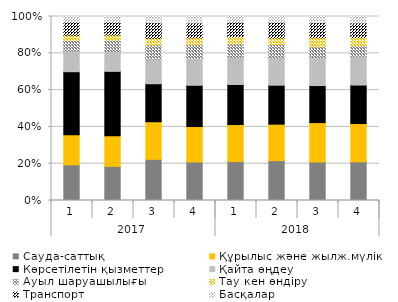
| Category | Сауда-саттық | Құрылыс және жылж.мүлік  | Көрсетілетін қызметтер  | Қайта өңдеу  | Ауыл шаруашылығы  | Тау кен өндіру  | Транспорт | Басқалар |
|---|---|---|---|---|---|---|---|---|
| 0 | 0.194 | 0.164 | 0.342 | 0.112 | 0.057 | 0.029 | 0.072 | 0.03 |
| 1 | 0.185 | 0.167 | 0.35 | 0.109 | 0.06 | 0.029 | 0.07 | 0.03 |
| 2 | 0.224 | 0.204 | 0.206 | 0.135 | 0.076 | 0.037 | 0.084 | 0.034 |
| 3 | 0.209 | 0.193 | 0.224 | 0.147 | 0.074 | 0.037 | 0.08 | 0.035 |
| 4 | 0.211 | 0.201 | 0.218 | 0.149 | 0.072 | 0.038 | 0.08 | 0.03 |
| 5 | 0.217 | 0.198 | 0.212 | 0.15 | 0.071 | 0.036 | 0.085 | 0.031 |
| 6 | 0.209 | 0.214 | 0.201 | 0.151 | 0.059 | 0.05 | 0.082 | 0.033 |
| 7 | 0.21 | 0.208 | 0.209 | 0.157 | 0.056 | 0.046 | 0.079 | 0.035 |